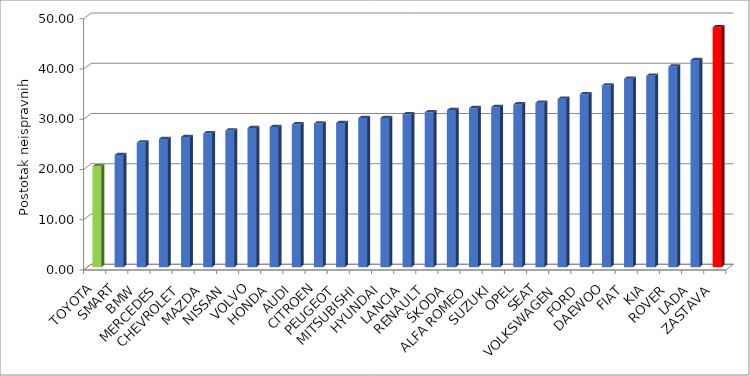
| Category | Series 4 |
|---|---|
| TOYOTA | 20.066 |
| SMART | 22.307 |
| BMW | 24.783 |
| MERCEDES | 25.504 |
| CHEVROLET | 25.91 |
| MAZDA | 26.623 |
| NISSAN | 27.197 |
| VOLVO | 27.67 |
| HONDA | 27.873 |
| AUDI | 28.402 |
| CITROEN | 28.599 |
| PEUGEOT | 28.689 |
| MITSUBISHI | 29.657 |
| HYUNDAI | 29.683 |
| LANCIA | 30.397 |
| RENAULT | 30.794 |
| ŠKODA | 31.249 |
| ALFA ROMEO | 31.638 |
| SUZUKI | 31.839 |
| OPEL | 32.393 |
| SEAT | 32.709 |
| VOLKSWAGEN | 33.485 |
| FORD | 34.397 |
| DAEWOO | 36.157 |
| FIAT | 37.495 |
| KIA | 38.092 |
| ROVER | 39.909 |
| LADA | 41.197 |
| ZASTAVA | 47.731 |